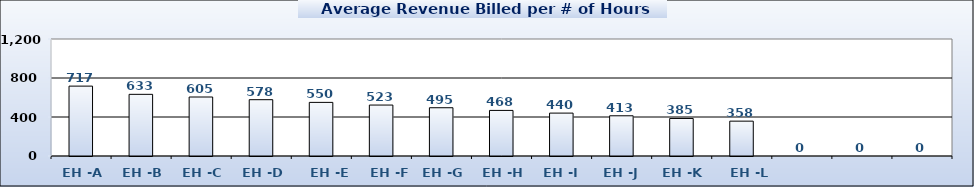
| Category | Series 0 |
|---|---|
| EH -A | 716.73 |
| EH -B | 632.5 |
| EH -C | 605 |
| EH -D | 577.5 |
| EH -E | 550 |
| EH -F | 522.5 |
| EH -G | 495 |
| EH -H | 467.5 |
| EH -I | 440 |
| EH -J | 412.5 |
| EH -K | 385 |
| EH -L | 357.5 |
|   | 0 |
|   | 0 |
|   | 0 |